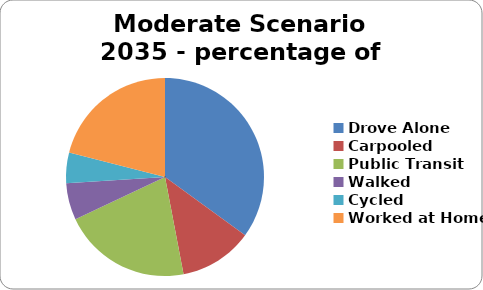
| Category | Moderate Scenario 2035 - percentage of VMTs |
|---|---|
| Drove Alone | 0.35 |
| Carpooled | 0.12 |
| Public Transit | 0.21 |
| Walked | 0.06 |
| Cycled | 0.05 |
| Worked at Home | 0.21 |